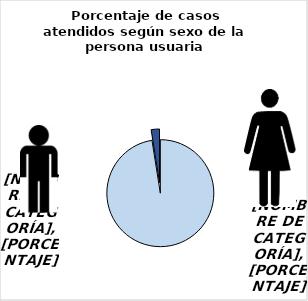
| Category | Series 0 |
|---|---|
| Mujer | 0.975 |
| Hombre | 0.025 |